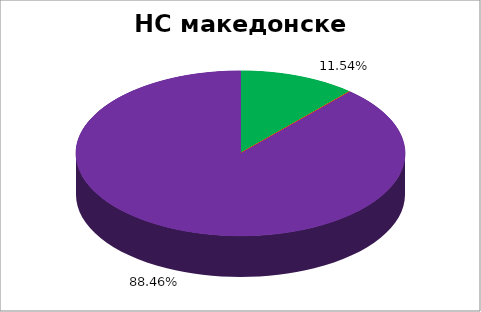
| Category | НС македонске НМ |
|---|---|
| 0 | 0.115 |
| 1 | 0 |
| 2 | 0 |
| 3 | 0 |
| 4 | 0.885 |